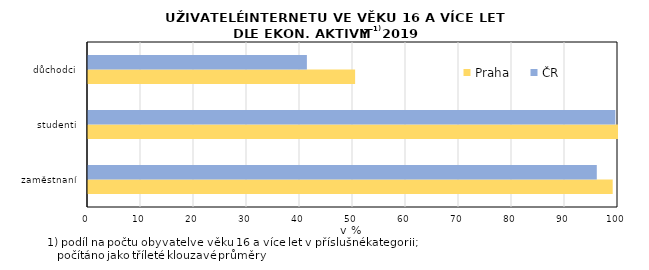
| Category | Praha | ČR |
|---|---|---|
| zaměstnaní | 99 | 96 |
| studenti | 100 | 99.5 |
| důchodci | 50.4 | 41.3 |